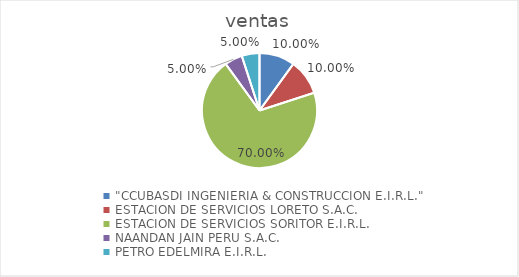
| Category | ventas |
|---|---|
| "CCUBASDI INGENIERIA & CONSTRUCCION E.I.R.L." | 0.1 |
| ESTACION DE SERVICIOS LORETO S.A.C. | 0.1 |
| ESTACION DE SERVICIOS SORITOR E.I.R.L. | 0.7 |
| NAANDAN JAIN PERU S.A.C. | 0.05 |
| PETRO EDELMIRA E.I.R.L. | 0.05 |